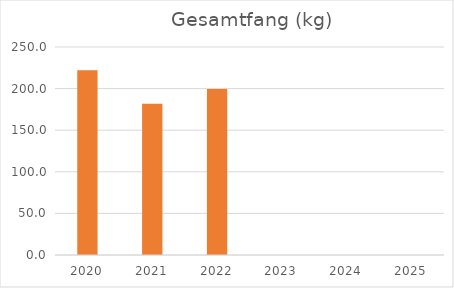
| Category | Gesamtfang (Stck.) |
|---|---|
| 2020.0 | 222.1 |
| 2021.0 | 181.8 |
| 2022.0 | 199.5 |
| 2023.0 | 0 |
| 2024.0 | 0 |
| 2025.0 | 0 |